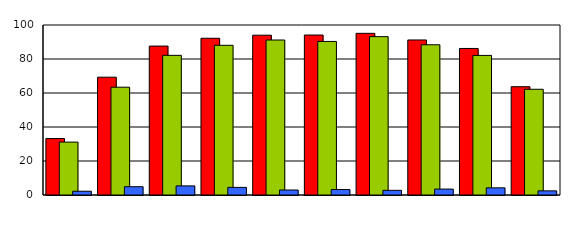
| Category | Series 0 | Series 1 | Series 2 |
|---|---|---|---|
| 0 | 33.2 | 31.111 | 2.222 |
| 1 | 69.3 | 63.415 | 4.878 |
| 2 | 87.6 | 82.143 | 5.357 |
| 3 | 92.2 | 88.06 | 4.478 |
| 4 | 94 | 91.176 | 2.941 |
| 5 | 94.1 | 90.323 | 3.226 |
| 6 | 95.1 | 93.151 | 2.74 |
| 7 | 91.2 | 88.372 | 3.488 |
| 8 | 86.2 | 82.105 | 4.211 |
| 9 | 63.7 | 62.195 | 2.439 |